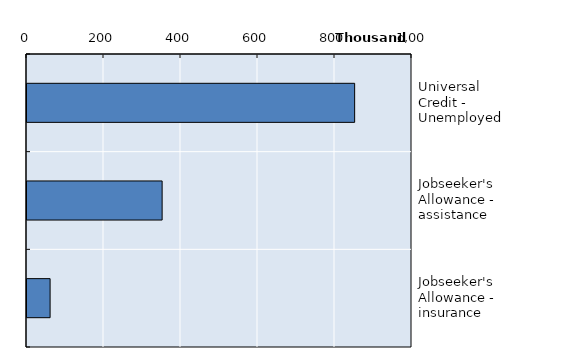
| Category | Series 0 |
|---|---|
| Universal Credit - Unemployed | 851017 |
| Jobseeker's Allowance - assistance | 351000 |
| Jobseeker's Allowance - insurance | 60000 |